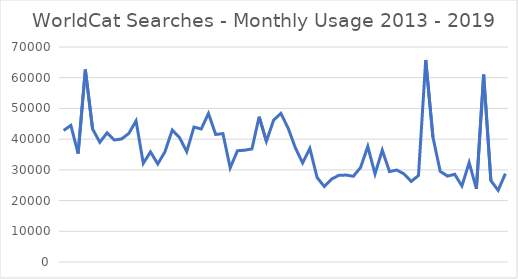
| Category | Series 0 |
|---|---|
| 0 | 42830 |
| 1 | 44477 |
| 2 | 35305 |
| 3 | 62647 |
| 4 | 43299 |
| 5 | 38981 |
| 6 | 42051 |
| 7 | 39721 |
| 8 | 40061 |
| 9 | 41847 |
| 10 | 45930 |
| 11 | 32140 |
| 12 | 35849 |
| 13 | 31916 |
| 14 | 35916 |
| 15 | 42966 |
| 16 | 40517 |
| 17 | 35942 |
| 18 | 43936 |
| 19 | 43301 |
| 20 | 48351 |
| 21 | 41518 |
| 22 | 41798 |
| 23 | 30641 |
| 24 | 36219 |
| 25 | 36402 |
| 26 | 36803 |
| 27 | 47310 |
| 28 | 39295 |
| 29 | 46208 |
| 30 | 48378 |
| 31 | 43609 |
| 32 | 37161 |
| 33 | 32281 |
| 34 | 37008 |
| 35 | 27505 |
| 36 | 24569 |
| 37 | 26992 |
| 38 | 28234 |
| 39 | 28302 |
| 40 | 27906 |
| 41 | 30751 |
| 42 | 37611 |
| 43 | 28679 |
| 44 | 36391 |
| 45 | 29435 |
| 46 | 29950 |
| 47 | 28692 |
| 48 | 26231 |
| 49 | 28158 |
| 50 | 65772 |
| 51 | 40584 |
| 52 | 29536 |
| 53 | 27963 |
| 54 | 28591 |
| 55 | 24750 |
| 56 | 32358 |
| 57 | 23785 |
| 58 | 60999 |
| 59 | 26449 |
| 60 | 23334 |
| 61 | 28752 |